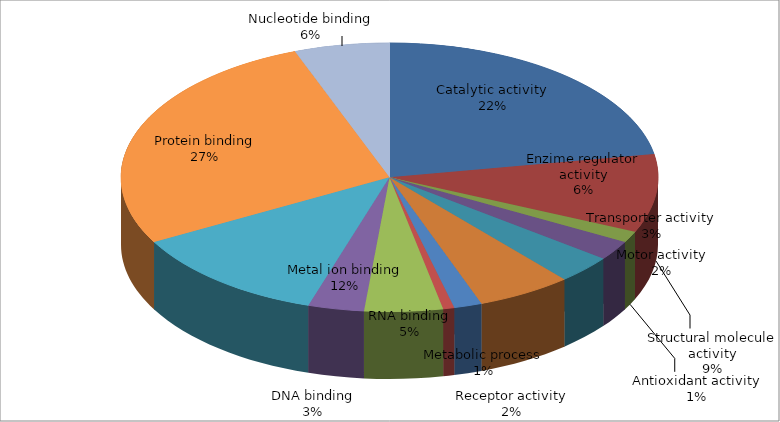
| Category | Series 0 |
|---|---|
| Catalytic activity | 22.222 |
| Structural molecule activity | 9.428 |
| Antioxidant activity | 1.347 |
| Motor activity | 2.357 |
| Transporter activity | 3.367 |
| Enzime regulator activity | 5.724 |
| Receptor activity | 1.684 |
| Metabolic process | 0.673 |
| RNA binding | 4.714 |
| DNA binding | 3.367 |
| Metal ion binding | 12.121 |
| Protein binding | 27.273 |
| Nucleotide binding | 5.724 |